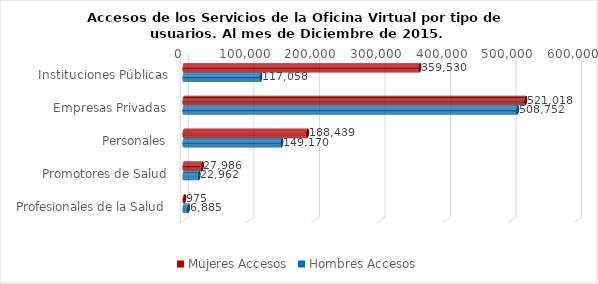
| Category | Mujeres | Hombres |
|---|---|---|
| Instituciones Públicas | 359530 | 117058 |
| Empresas Privadas | 521018 | 508752 |
| Personales | 188439 | 149170 |
| Promotores de Salud | 27986 | 22962 |
| Profesionales de la Salud | 975 | 6885 |